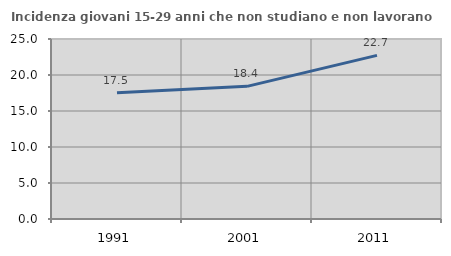
| Category | Incidenza giovani 15-29 anni che non studiano e non lavorano  |
|---|---|
| 1991.0 | 17.532 |
| 2001.0 | 18.421 |
| 2011.0 | 22.727 |